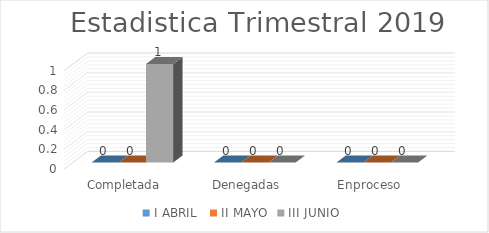
| Category | I ABRIL  | II MAYO | III JUNIO  |
|---|---|---|---|
| Completada | 0 | 0 | 1 |
| Denegadas | 0 | 0 | 0 |
| Enproceso | 0 | 0 | 0 |